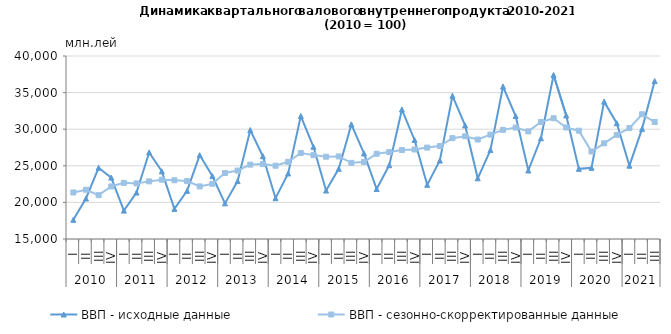
| Category | ВВП - исходные данные | ВВП - сезонно-скорректированные данные |
|---|---|---|
| 0 | 17618.538 | 21360.1 |
| 1 | 20535.088 | 21731.993 |
| 2 | 24733.989 | 20989.976 |
| 3 | 23387.763 | 22182.179 |
| 4 | 18878.295 | 22667.842 |
| 5 | 21341.813 | 22594.998 |
| 6 | 26828.484 | 22872.715 |
| 7 | 24246.43 | 23103.478 |
| 8 | 19113.189 | 23022.245 |
| 9 | 21579.683 | 22910.476 |
| 10 | 26464.253 | 22185.978 |
| 11 | 23599.498 | 22540.946 |
| 12 | 19867.239 | 24011.652 |
| 13 | 22910.429 | 24346.311 |
| 14 | 29875.092 | 25163.944 |
| 15 | 26311.771 | 25231.733 |
| 16 | 20575.18 | 25013.013 |
| 17 | 23951.428 | 25542.965 |
| 18 | 31790.125 | 26750.923 |
| 19 | 27595.654 | 26460.141 |
| 20 | 21618.259 | 26238.912 |
| 21 | 24596.839 | 26278.666 |
| 22 | 30659.04 | 25404.694 |
| 23 | 26686.781 | 25524.536 |
| 24 | 21830.624 | 26648.884 |
| 25 | 25078.445 | 26875.706 |
| 26 | 32689.956 | 27151.3 |
| 27 | 28527.778 | 27226.362 |
| 28 | 22398.641 | 27485.255 |
| 29 | 25719.356 | 27703.583 |
| 30 | 34566.719 | 28777.075 |
| 31 | 30514.091 | 29034.759 |
| 32 | 23292.847 | 28586.639 |
| 33 | 27146.722 | 29261.33 |
| 34 | 35830.318 | 29908.693 |
| 35 | 31798.143 | 30225.276 |
| 36 | 24359.694 | 29701.083 |
| 37 | 28761.729 | 30979.738 |
| 38 | 37410.428 | 31495.378 |
| 39 | 31885.101 | 30236.441 |
| 40 | 24582.491 | 29798.471 |
| 41 | 24723.055 | 26952.243 |
| 42 | 33764.152 | 28069.662 |
| 43 | 30815.959 | 29226.471 |
| 44 | 25015.77 | 30146.403 |
| 45 | 30045.093 | 32038.814 |
| 46 | 36578.121 | 30985.293 |